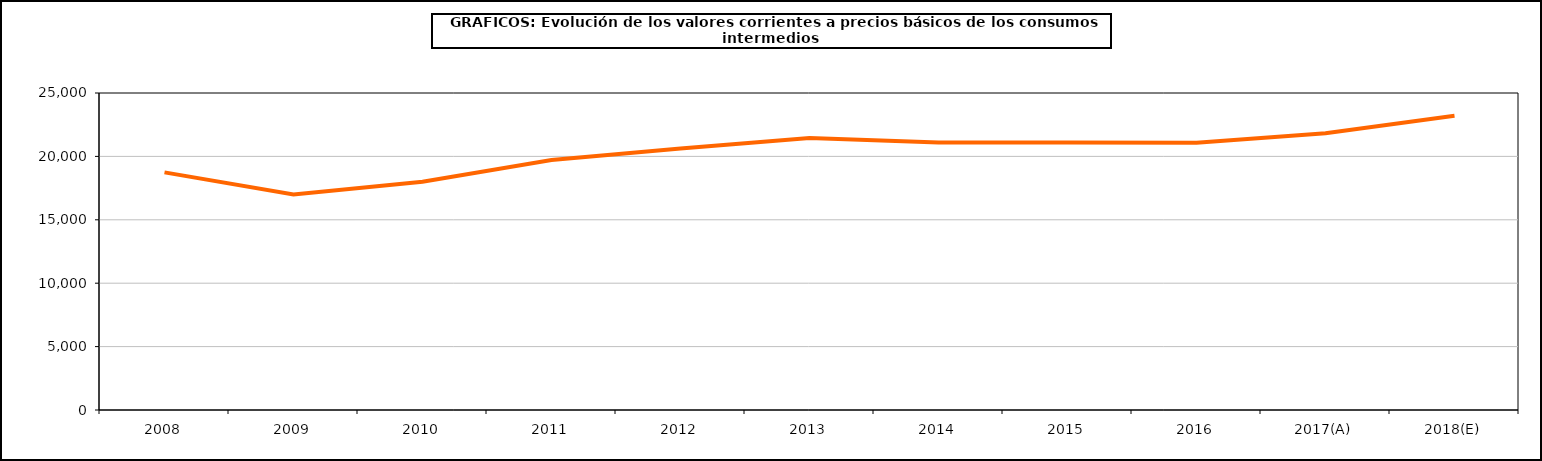
| Category | Total consumos intermedios |
|---|---|
| 2008 | 18741.8 |
| 2009 | 16992.3 |
| 2010 | 18005.1 |
| 2011 | 19714.8 |
| 2012 | 20625.1 |
| 2013 | 21445.2 |
| 2014 | 21097.4 |
| 2015 | 21104.1 |
| 2016 | 21083.6 |
| 2017(A) | 21834.7 |
| 2018(E) | 23204.7 |